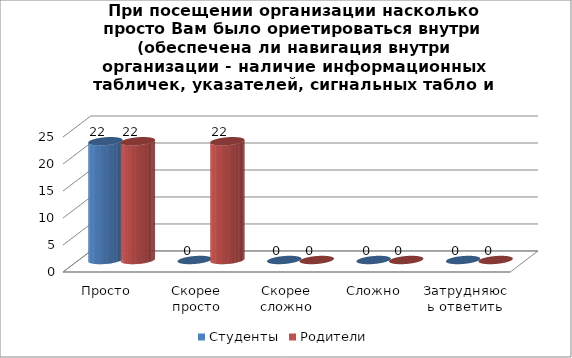
| Category | Студенты | Родители |
|---|---|---|
| Просто | 22 | 22 |
| Скорее просто | 0 | 22 |
| Скорее сложно | 0 | 0 |
| Сложно | 0 | 0 |
| Затрудняюсь ответить | 0 | 0 |